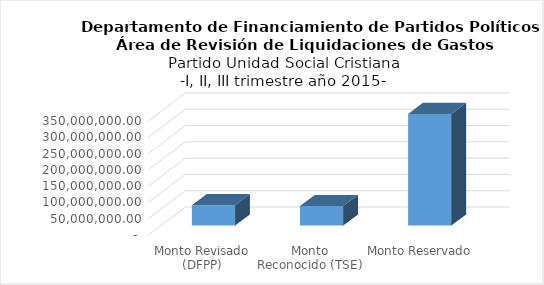
| Category | Series 0 |
|---|---|
| Monto Revisado (DFPP) | 62500834.44 |
| Monto Reconocido (TSE) | 59878880.92 |
| Monto Reservado  | 342446565.187 |